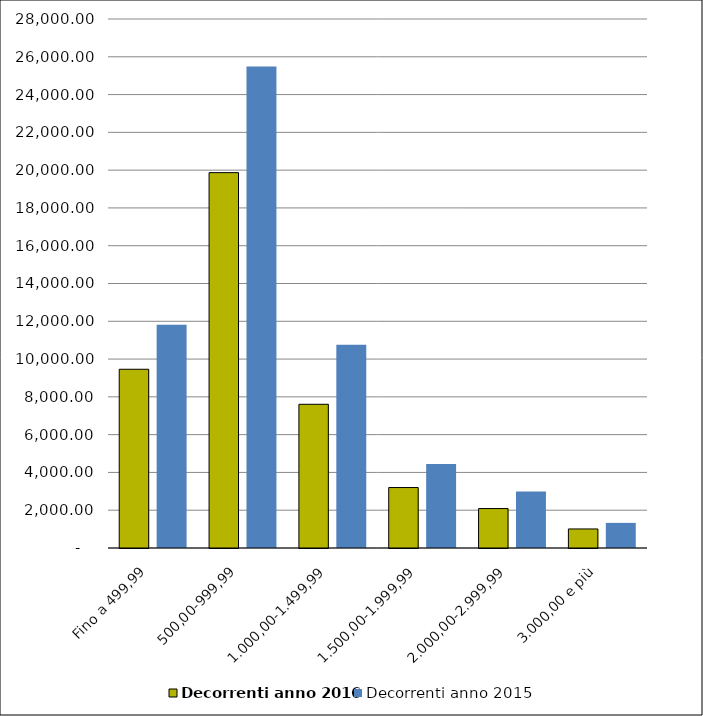
| Category | Decorrenti anno 2016 | Decorrenti anno 2015 |
|---|---|---|
| Fino a 499,99 | 9461 | 11811 |
| 500,00-999,99 | 19868 | 25482 |
| 1.000,00-1.499,99 | 7607 | 10755 |
| 1.500,00-1.999,99 | 3200 | 4441 |
| 2.000,00-2.999,99 | 2088 | 2991 |
| 3.000,00 e più | 1008 | 1329 |